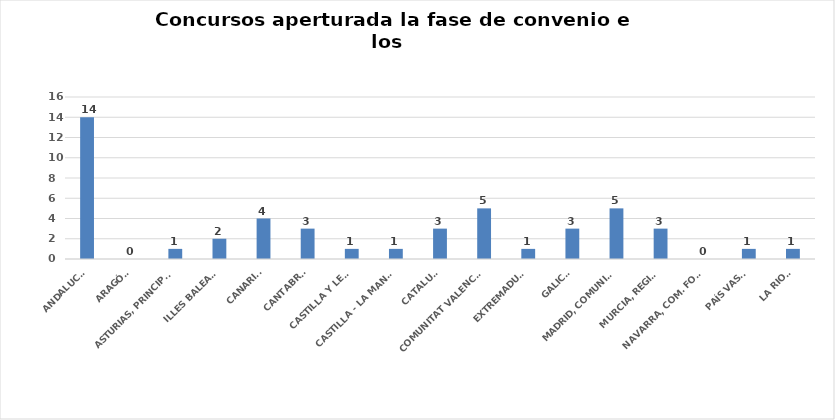
| Category | Series 0 |
|---|---|
| ANDALUCÍA | 14 |
| ARAGÓN | 0 |
| ASTURIAS, PRINCIPADO | 1 |
| ILLES BALEARS | 2 |
| CANARIAS | 4 |
| CANTABRIA | 3 |
| CASTILLA Y LEÓN | 1 |
| CASTILLA - LA MANCHA | 1 |
| CATALUÑA | 3 |
| COMUNITAT VALENCIANA | 5 |
| EXTREMADURA | 1 |
| GALICIA | 3 |
| MADRID, COMUNIDAD | 5 |
| MURCIA, REGIÓN | 3 |
| NAVARRA, COM. FORAL | 0 |
| PAÍS VASCO | 1 |
| LA RIOJA | 1 |